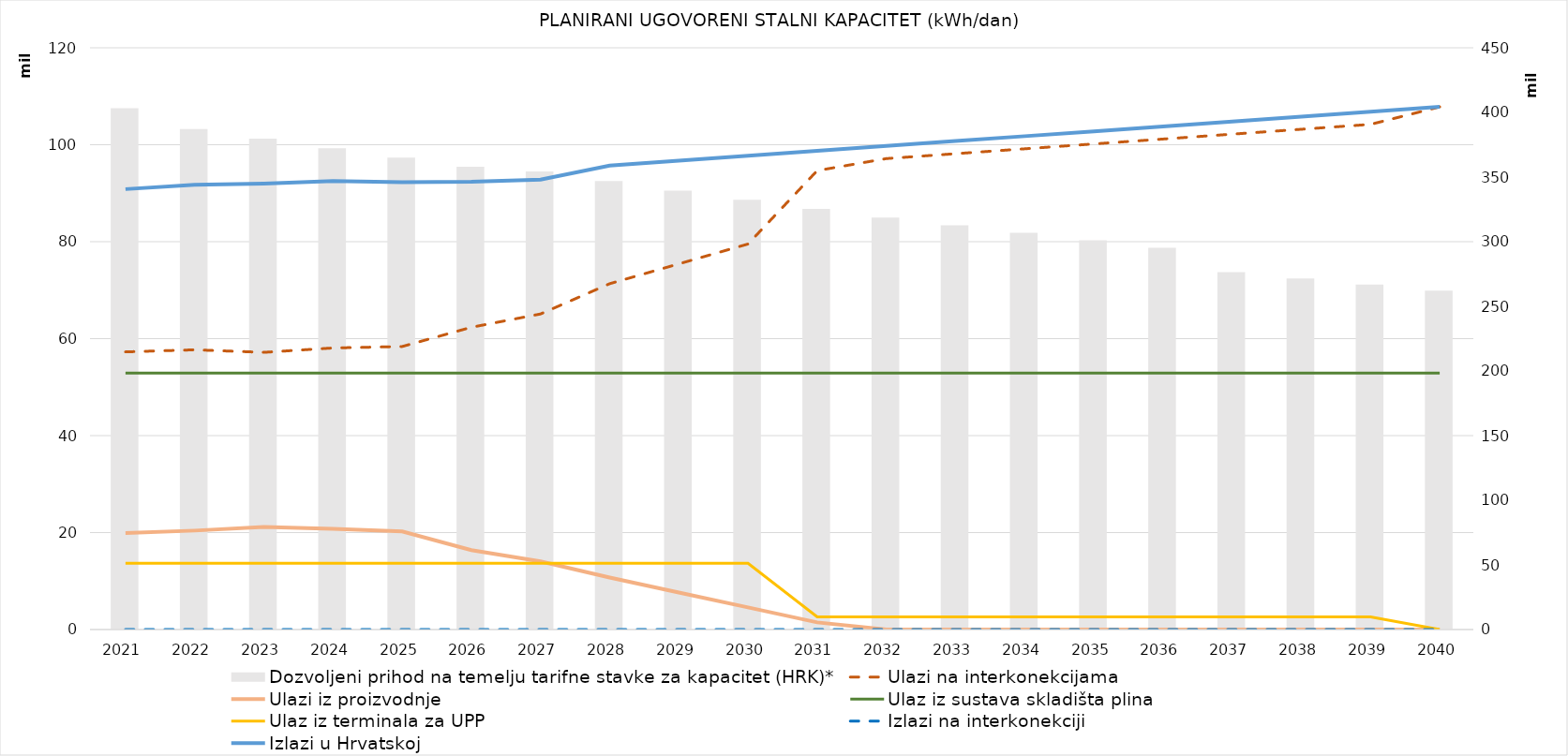
| Category | Dozvoljeni prihod na temelju tarifne stavke za kapacitet (HRK)* |
|---|---|
| 2021. | 403196158 |
| 2022. | 387207143 |
| 2023. | 379690399.637 |
| 2024. | 372319576.698 |
| 2025. | 365091841.472 |
| 2026. | 358004416.237 |
| 2027. | 354324789 |
| 2028. | 346859499.122 |
| 2029. | 339551495.877 |
| 2030. | 332397465.383 |
| 2031. | 325394163.58 |
| 2032. | 318704822 |
| 2033. | 312693861.177 |
| 2034. | 306796270.618 |
| 2035. | 301009912.094 |
| 2036. | 295332687.703 |
| 2037. | 276441066 |
| 2038. | 271580929.48 |
| 2039. | 266806239.479 |
| 2040. | 262115493.755 |